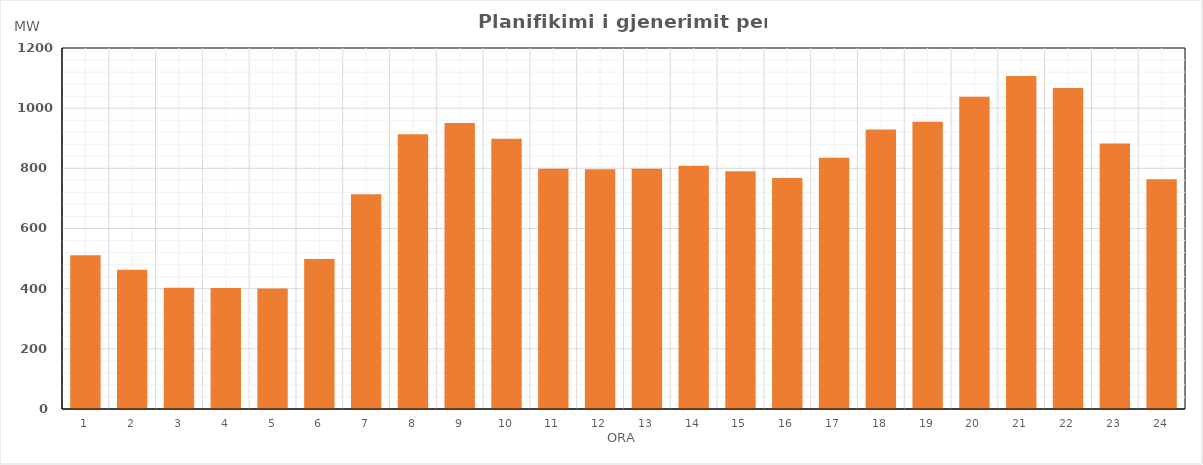
| Category | Max (MW) |
|---|---|
| 0 | 510.69 |
| 1 | 462.9 |
| 2 | 402.9 |
| 3 | 401.9 |
| 4 | 400.9 |
| 5 | 498.54 |
| 6 | 713.45 |
| 7 | 913.5 |
| 8 | 950.49 |
| 9 | 898.65 |
| 10 | 798.66 |
| 11 | 796.73 |
| 12 | 798.78 |
| 13 | 808.78 |
| 14 | 790.58 |
| 15 | 767.54 |
| 16 | 835.08 |
| 17 | 929.12 |
| 18 | 955.18 |
| 19 | 1038.16 |
| 20 | 1106.67 |
| 21 | 1066.71 |
| 22 | 882.6 |
| 23 | 763.64 |